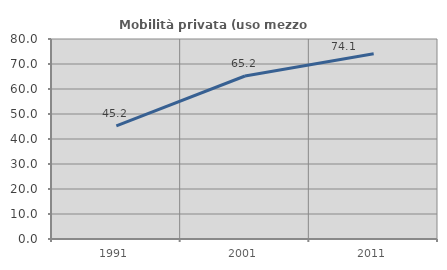
| Category | Mobilità privata (uso mezzo privato) |
|---|---|
| 1991.0 | 45.229 |
| 2001.0 | 65.207 |
| 2011.0 | 74.112 |